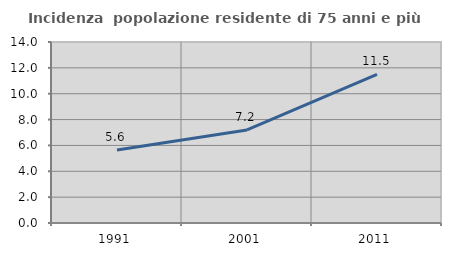
| Category | Incidenza  popolazione residente di 75 anni e più |
|---|---|
| 1991.0 | 5.644 |
| 2001.0 | 7.202 |
| 2011.0 | 11.493 |